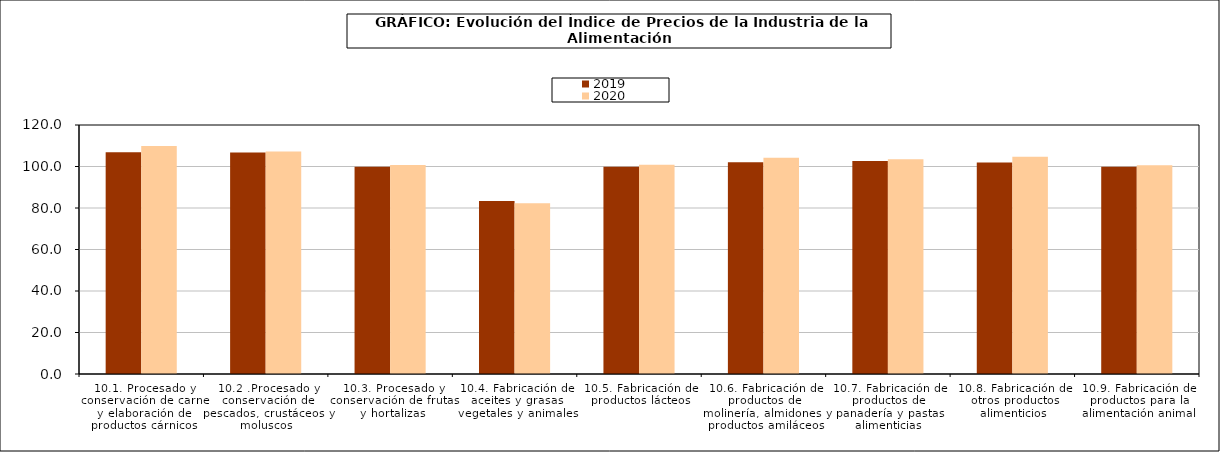
| Category | 2019 | 2020 |
|---|---|---|
| 10.1. Procesado y conservación de carne y elaboración de productos cárnicos | 106.91 | 109.903 |
| 10.2 .Procesado y conservación de pescados, crustáceos y moluscos | 106.698 | 107.265 |
| 10.3. Procesado y conservación de frutas y hortalizas | 99.85 | 100.766 |
| 10.4. Fabricación de aceites y grasas vegetales y animales | 83.344 | 82.257 |
| 10.5. Fabricación de productos lácteos | 99.887 | 100.848 |
| 10.6. Fabricación de productos de molinería, almidones y productos amiláceos | 102.067 | 104.237 |
| 10.7. Fabricación de productos de panadería y pastas alimenticias | 102.697 | 103.53 |
| 10.8. Fabricación de otros productos alimenticios | 101.916 | 104.646 |
| 10.9. Fabricación de productos para la alimentación animal | 99.928 | 100.554 |